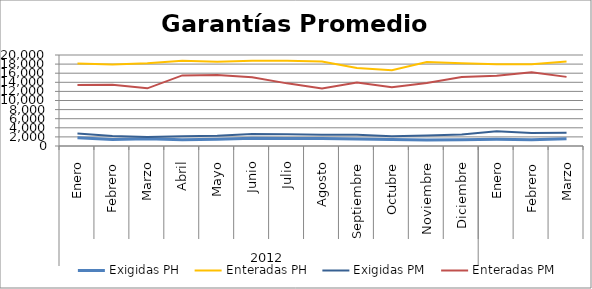
| Category | Exigidas PH | Enteradas PH | Exigidas PM | Enteradas PM |
|---|---|---|---|---|
| 0 | 1828.564 | 18155.583 | 2744.93 | 13413.991 |
| 1 | 1451.155 | 17917.734 | 2215.902 | 13440.832 |
| 2 | 1587.31 | 18166.129 | 1968.766 | 12673.714 |
| 3 | 1353.003 | 18741.256 | 2118.782 | 15515.723 |
| 4 | 1464.668 | 18540.927 | 2278.002 | 15625.393 |
| 5 | 1719.43 | 18734.539 | 2626.915 | 15127.903 |
| 6 | 1674.023 | 18761.463 | 2556.575 | 13766.49 |
| 7 | 1647.243 | 18544.546 | 2463.76 | 12637.427 |
| 8 | 1556.152 | 17124.972 | 2459.803 | 13929.715 |
| 9 | 1402.926 | 16653.067 | 2169.047 | 12937.81 |
| 10 | 1329.011 | 18467.462 | 2322.009 | 13825.53 |
| 11 | 1379.519 | 18204.98 | 2522.413 | 15188.776 |
| 12 | 1462.675 | 17957.148 | 3246.817 | 15415.235 |
| 13 | 1398.609 | 17993.637 | 2845.352 | 16230.589 |
| 14 | 1589.589 | 18548.479 | 2894.834 | 15192.36 |